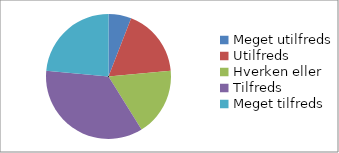
| Category | Hvor tilfreds er du med workshoppen 'Praktik på diplomingeniøruddannelserne'? (n=17) |
|---|---|
| Meget utilfreds | 0.059 |
| Utilfreds | 0.176 |
| Hverken eller | 0.176 |
| Tilfreds | 0.353 |
| Meget tilfreds | 0.235 |